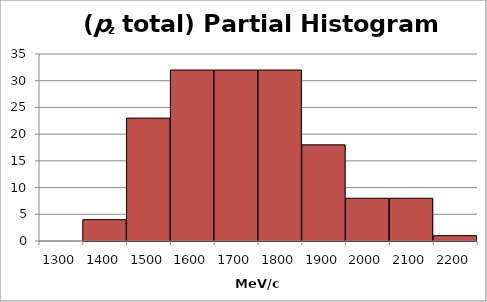
| Category | Series 1 |
|---|---|
| 1300.0 | 0 |
| 1400.0 | 4 |
| 1500.0 | 23 |
| 1600.0 | 32 |
| 1700.0 | 32 |
| 1800.0 | 32 |
| 1900.0 | 18 |
| 2000.0 | 8 |
| 2100.0 | 8 |
| 2200.0 | 1 |